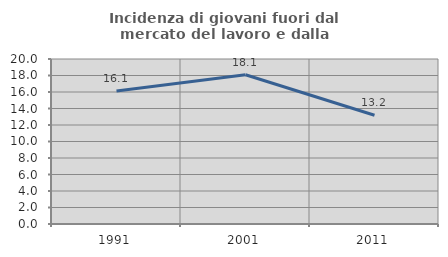
| Category | Incidenza di giovani fuori dal mercato del lavoro e dalla formazione  |
|---|---|
| 1991.0 | 16.129 |
| 2001.0 | 18.095 |
| 2011.0 | 13.187 |